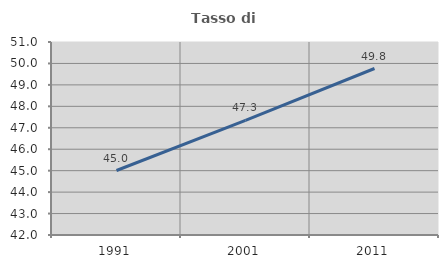
| Category | Tasso di occupazione   |
|---|---|
| 1991.0 | 45.007 |
| 2001.0 | 47.347 |
| 2011.0 | 49.764 |